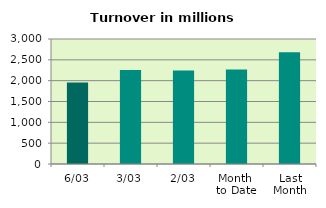
| Category | Series 0 |
|---|---|
| 6/03 | 1953.527 |
| 3/03 | 2254.786 |
| 2/03 | 2245.909 |
| Month 
to Date | 2265.243 |
| Last
Month | 2679.99 |